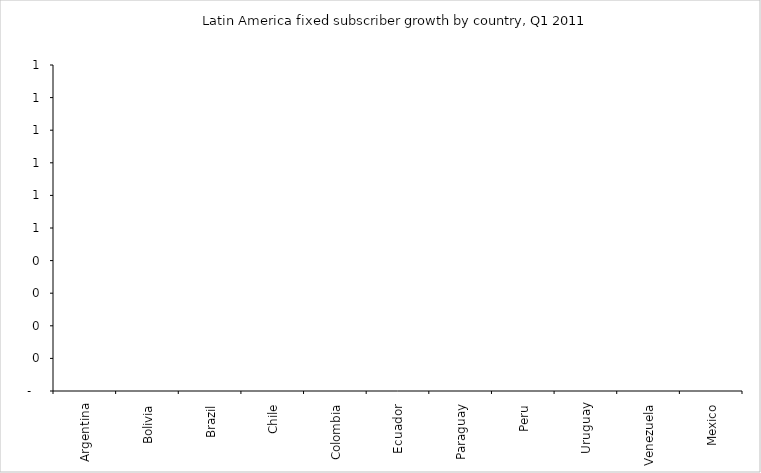
| Category | Series 3 |
|---|---|
| Argentina | 0 |
| Bolivia | 0 |
| Brazil | 0 |
| Chile | 0 |
| Colombia | 0 |
| Ecuador | 0 |
| Paraguay | 0 |
| Peru | 0 |
| Uruguay | 0 |
| Venezuela | 0 |
| Mexico | 0 |